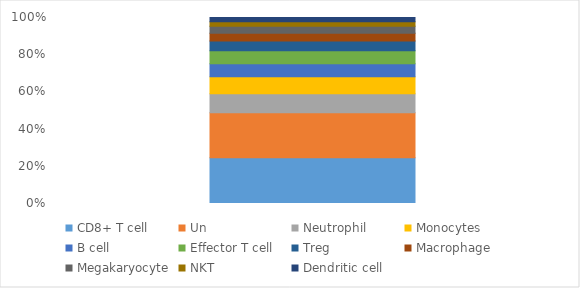
| Category | CD8+ T cell | Un | Neutrophil | Monocytes | B cell | Effector T cell | Treg | Macrophage | Megakaryocyte | NKT | Dendritic cell |
|---|---|---|---|---|---|---|---|---|---|---|---|
| 0 | 2822 | 2788 | 1178 | 1042 | 814 | 799 | 600 | 485 | 421 | 282 | 264 |